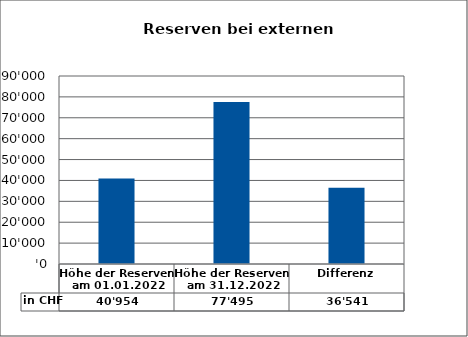
| Category | in CHF |
|---|---|
| Höhe der Reserven am 01.01.2022 | 40953.86 |
| Höhe der Reserven am 31.12.2022 | 77495 |
| Differenz | 36541.14 |